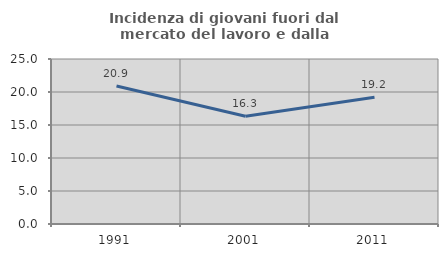
| Category | Incidenza di giovani fuori dal mercato del lavoro e dalla formazione  |
|---|---|
| 1991.0 | 20.909 |
| 2001.0 | 16.327 |
| 2011.0 | 19.218 |